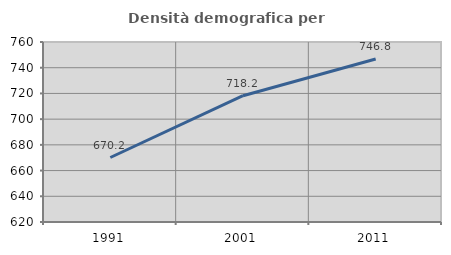
| Category | Densità demografica |
|---|---|
| 1991.0 | 670.167 |
| 2001.0 | 718.244 |
| 2011.0 | 746.822 |